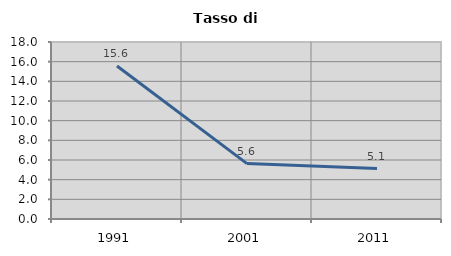
| Category | Tasso di disoccupazione   |
|---|---|
| 1991.0 | 15.556 |
| 2001.0 | 5.634 |
| 2011.0 | 5.128 |